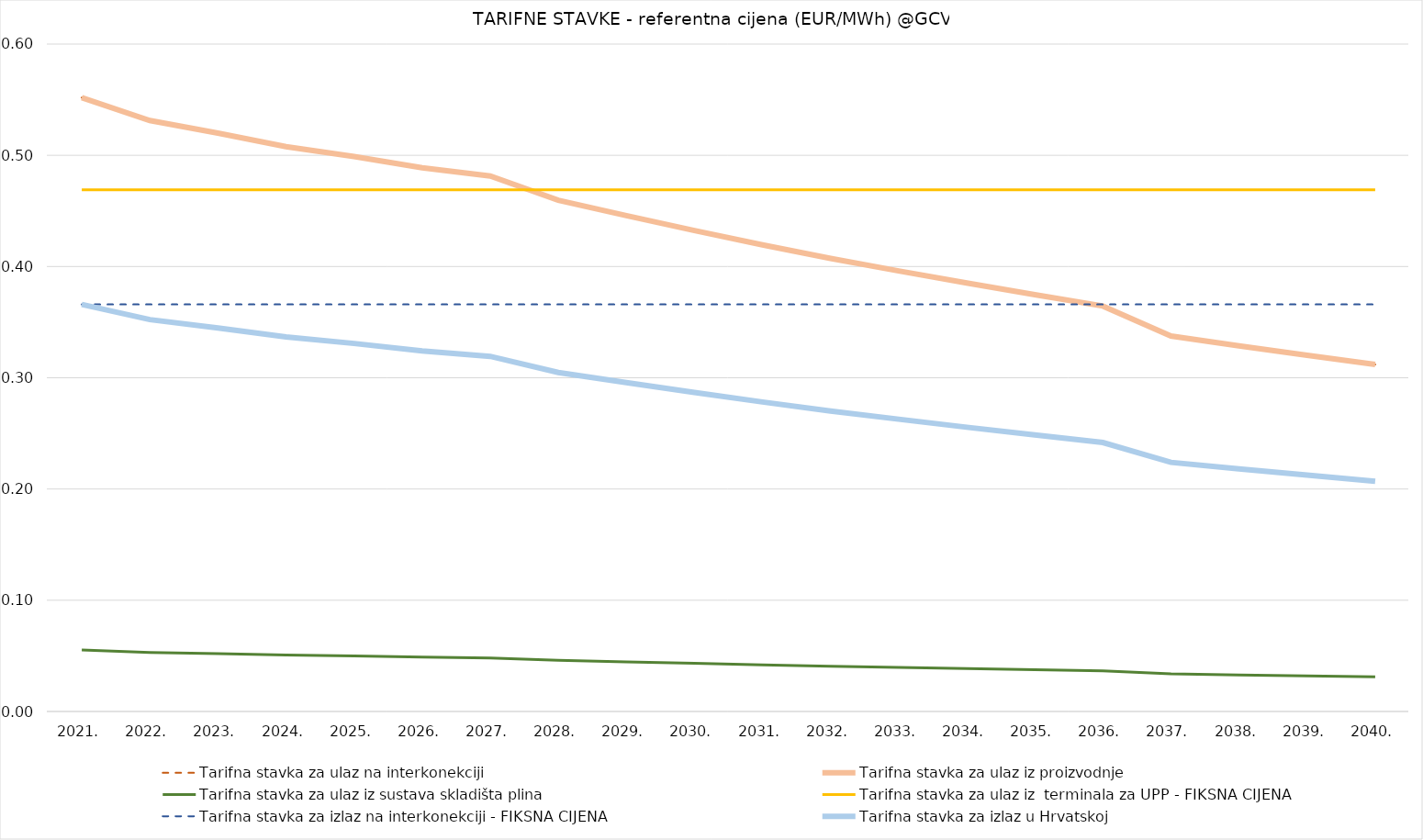
| Category | Tarifna stavka za ulaz na interkonekciji | Tarifna stavka za ulaz iz proizvodnje | Tarifna stavka za ulaz iz sustava skladišta plina | Tarifna stavka za ulaz iz  terminala za UPP - FIKSNA CIJENA | Tarifna stavka za izlaz na interkonekciji - FIKSNA CIJENA | Tarifna stavka za izlaz u Hrvatskoj |
|---|---|---|---|---|---|---|
| 2021. | 0.552 | 0.552 | 0.055 | 0.469 | 0.366 | 0.366 |
| 2022. | 0.531 | 0.531 | 0.053 | 0.469 | 0.366 | 0.352 |
| 2023. | 0.52 | 0.52 | 0.052 | 0.469 | 0.366 | 0.345 |
| 2024. | 0.508 | 0.508 | 0.051 | 0.469 | 0.366 | 0.337 |
| 2025. | 0.499 | 0.499 | 0.05 | 0.469 | 0.366 | 0.331 |
| 2026. | 0.489 | 0.489 | 0.049 | 0.469 | 0.366 | 0.324 |
| 2027. | 0.481 | 0.481 | 0.048 | 0.469 | 0.366 | 0.319 |
| 2028. | 0.46 | 0.46 | 0.046 | 0.469 | 0.366 | 0.305 |
| 2029. | 0.446 | 0.446 | 0.045 | 0.469 | 0.366 | 0.296 |
| 2030. | 0.432 | 0.432 | 0.043 | 0.469 | 0.366 | 0.287 |
| 2031. | 0.419 | 0.419 | 0.042 | 0.469 | 0.366 | 0.278 |
| 2032. | 0.407 | 0.407 | 0.041 | 0.469 | 0.366 | 0.27 |
| 2033. | 0.396 | 0.396 | 0.04 | 0.469 | 0.366 | 0.263 |
| 2034. | 0.385 | 0.385 | 0.039 | 0.469 | 0.366 | 0.256 |
| 2035. | 0.375 | 0.375 | 0.037 | 0.469 | 0.366 | 0.249 |
| 2036. | 0.364 | 0.364 | 0.036 | 0.469 | 0.366 | 0.242 |
| 2037. | 0.338 | 0.338 | 0.034 | 0.469 | 0.366 | 0.224 |
| 2038. | 0.329 | 0.329 | 0.033 | 0.469 | 0.366 | 0.218 |
| 2039. | 0.32 | 0.32 | 0.032 | 0.469 | 0.366 | 0.212 |
| 2040. | 0.312 | 0.312 | 0.031 | 0.469 | 0.366 | 0.207 |